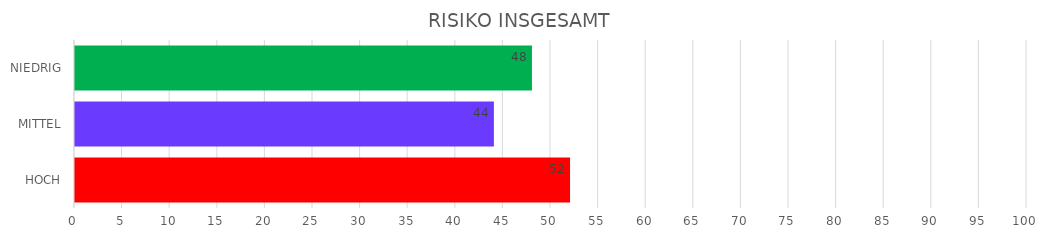
| Category | Series 1 | Series 0 |
|---|---|---|
| HOCH | 52 | 52 |
| MITTEL | 44 | 44 |
| NIEDRIG | 48 | 48 |